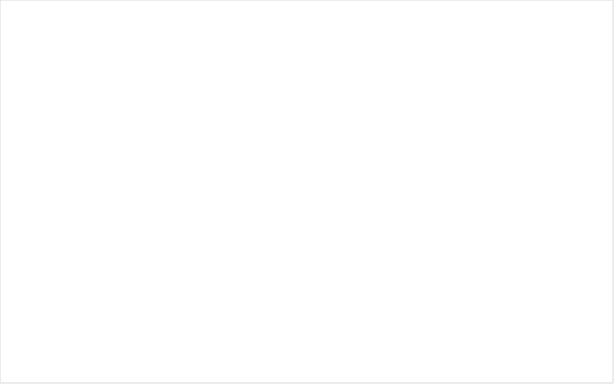
| Category | Итог |
|---|---|
| Ні | 16 |